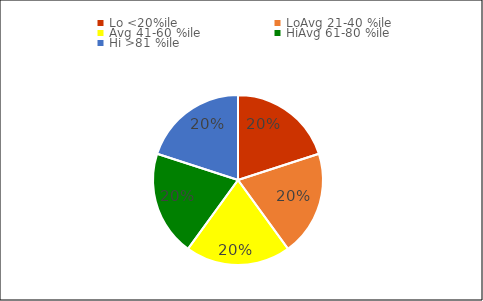
| Category | Percentage per quintile |
|---|---|
| Lo <20%ile | 0.2 |
| LoAvg 21-40 %ile | 0.2 |
| Avg 41-60 %ile | 0.2 |
| HiAvg 61-80 %ile | 0.2 |
| Hi >81 %ile  | 0.2 |